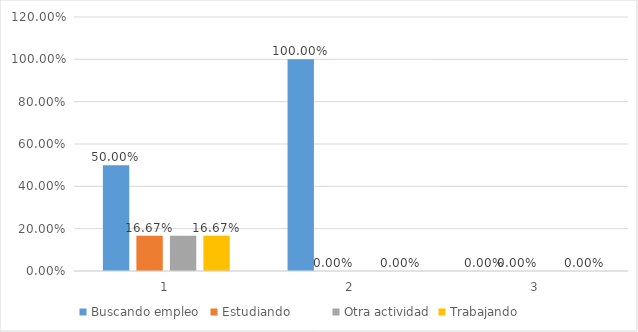
| Category | Buscando empleo  | Estudiando          | Otra actividad | Trabajando          |
|---|---|---|---|---|
| 0 | 0.5 | 0.167 | 0.167 | 0.167 |
| 1 | 1 | 0 | 0 | 0 |
| 2 | 0 | 0 | 0 | 0 |